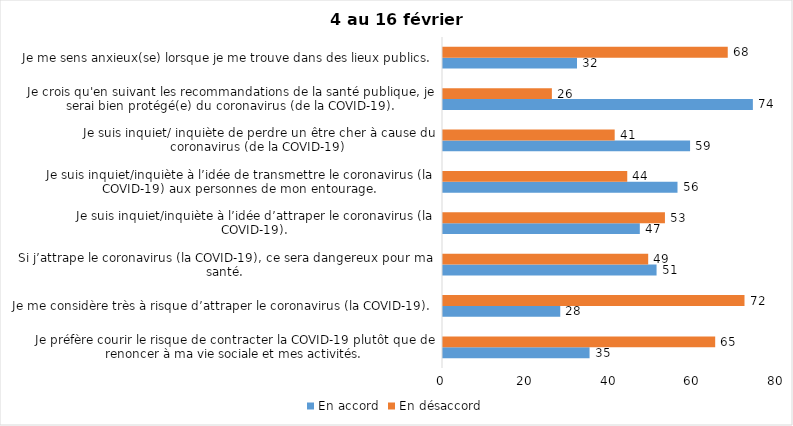
| Category | En accord | En désaccord |
|---|---|---|
| Je préfère courir le risque de contracter la COVID-19 plutôt que de renoncer à ma vie sociale et mes activités. | 35 | 65 |
| Je me considère très à risque d’attraper le coronavirus (la COVID-19). | 28 | 72 |
| Si j’attrape le coronavirus (la COVID-19), ce sera dangereux pour ma santé. | 51 | 49 |
| Je suis inquiet/inquiète à l’idée d’attraper le coronavirus (la COVID-19). | 47 | 53 |
| Je suis inquiet/inquiète à l’idée de transmettre le coronavirus (la COVID-19) aux personnes de mon entourage. | 56 | 44 |
| Je suis inquiet/ inquiète de perdre un être cher à cause du coronavirus (de la COVID-19) | 59 | 41 |
| Je crois qu'en suivant les recommandations de la santé publique, je serai bien protégé(e) du coronavirus (de la COVID-19). | 74 | 26 |
| Je me sens anxieux(se) lorsque je me trouve dans des lieux publics. | 32 | 68 |